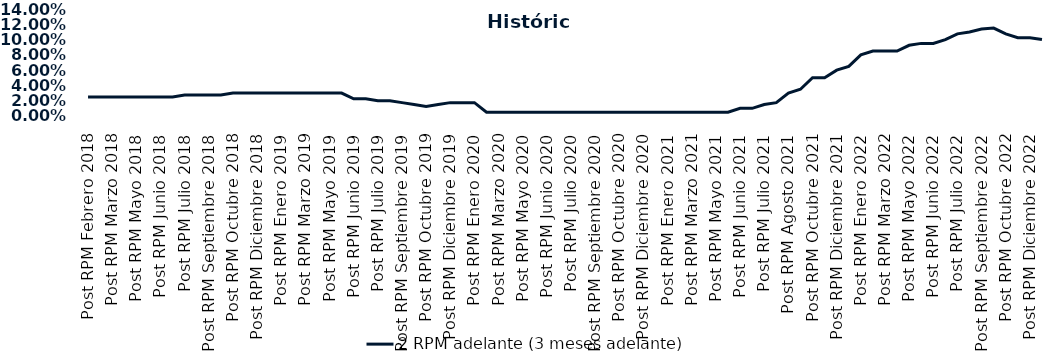
| Category | 2 RPM adelante (3 meses adelante) |
|---|---|
| Post RPM Febrero 2018 | 0.025 |
| Pre RPM Marzo 2018 | 0.025 |
| Post RPM Marzo 2018 | 0.025 |
| Pre RPM Mayo 2018 | 0.025 |
| Post RPM Mayo 2018 | 0.025 |
| Pre RPM Junio 2018 | 0.025 |
| Post RPM Junio 2018 | 0.025 |
| Pre RPM Julio 2018 | 0.025 |
| Post RPM Julio 2018 | 0.028 |
| Pre RPM Septiembre 2018 | 0.028 |
| Post RPM Septiembre 2018 | 0.028 |
| Pre RPM Octubre 2018 | 0.028 |
| Post RPM Octubre 2018 | 0.03 |
| Pre RPM Diciembre 2018 | 0.03 |
| Post RPM Diciembre 2018 | 0.03 |
| Pre RPM Enero 2019 | 0.03 |
| Post RPM Enero 2019 | 0.03 |
| Pre RPM Marzo 2019 | 0.03 |
| Post RPM Marzo 2019 | 0.03 |
| Pre RPM Mayo 2019 | 0.03 |
| Post RPM Mayo 2019 | 0.03 |
| Pre RPM Junio 2019 | 0.03 |
| Post RPM Junio 2019 | 0.022 |
| Pre RPM Julio 2019 | 0.022 |
| Post RPM Julio 2019 | 0.02 |
| Pre RPM Septiembre 2019 | 0.02 |
| Post RPM Septiembre 2019 | 0.018 |
| Pre RPM Octubre 2019 | 0.015 |
| Post RPM Octubre 2019 | 0.012 |
| Pre RPM Diciembre 2019 | 0.015 |
| Post RPM Diciembre 2019 | 0.018 |
| Pre RPM Enero 2020 | 0.018 |
| Post RPM Enero 2020 | 0.018 |
| Pre RPM Marzo 2020 | 0.005 |
| Post RPM Marzo 2020 | 0.005 |
| Pre RPM Mayo 2020 | 0.005 |
| Post RPM Mayo 2020 | 0.005 |
| Pre RPM Junio 2020 | 0.005 |
| Post RPM Junio 2020 | 0.005 |
| Pre RPM Julio 2020 | 0.005 |
| Post RPM Julio 2020 | 0.005 |
| Pre RPM Septiembre 2020 | 0.005 |
| Post RPM Septiembre 2020 | 0.005 |
| Pre RPM Octubre 2020 | 0.005 |
| Post RPM Octubre 2020 | 0.005 |
| Pre RPM Diciembre 2020 | 0.005 |
| Post RPM Diciembre 2020 | 0.005 |
| Pre RPM Enero 2021 | 0.005 |
| Post RPM Enero 2021 | 0.005 |
| Pre RPM Marzo 2021 | 0.005 |
| Post RPM Marzo 2021 | 0.005 |
| Pre RPM Mayo 2021 | 0.005 |
| Post RPM Mayo 2021 | 0.005 |
| Pre RPM Junio 2021 | 0.005 |
| Post RPM Junio 2021 | 0.01 |
| Pre RPM Julio 2021 | 0.01 |
| Post RPM Julio 2021 | 0.015 |
| Pre RPM Agosto 2021 | 0.018 |
| Post RPM Agosto 2021 | 0.03 |
| Pre RPM Octubre 2021 | 0.035 |
| Post RPM Octubre 2021 | 0.05 |
| Pre RPM Diciembre 2021 | 0.05 |
| Post RPM Diciembre 2021 | 0.06 |
| Pre RPM Enero 2022 | 0.065 |
| Post RPM Enero 2022 | 0.08 |
| Pre RPM Marzo 2022 | 0.085 |
| Post RPM Marzo 2022 | 0.085 |
| Pre RPM Mayo 2022 | 0.085 |
| Post RPM Mayo 2022 | 0.092 |
| Pre RPM Junio 2022 | 0.095 |
| Post RPM Junio 2022 | 0.095 |
| Pre RPM Julio 2022 | 0.1 |
| Post RPM Julio 2022 | 0.108 |
| Pre RPM Septiembre 2022 | 0.11 |
| Post RPM Septiembre 2022 | 0.114 |
| Pre RPM Octubre 2022 | 0.115 |
| Post RPM Octubre 2022 | 0.108 |
| Pre RPM Diciembre 2022 | 0.102 |
| Post RPM Diciembre 2022 | 0.102 |
| Pre RPM Enero 2023 | 0.1 |